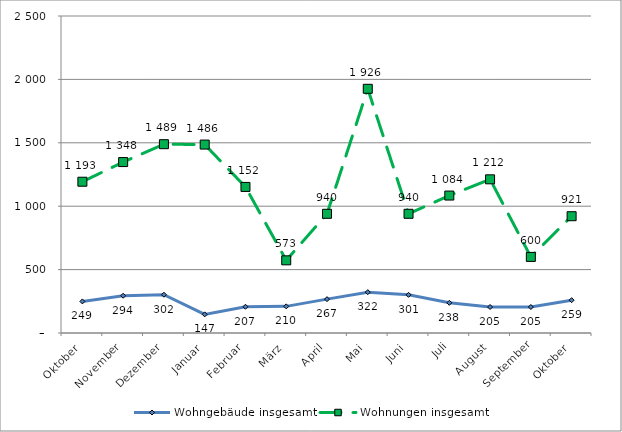
| Category | Wohngebäude insgesamt | Wohnungen insgesamt |
|---|---|---|
| Oktober | 249 | 1193 |
| November | 294 | 1348 |
| Dezember | 302 | 1489 |
| Januar | 147 | 1486 |
| Februar | 207 | 1152 |
| März | 210 | 573 |
| April | 267 | 940 |
| Mai | 322 | 1926 |
| Juni | 301 | 940 |
| Juli | 238 | 1084 |
| August | 205 | 1212 |
| September | 205 | 600 |
| Oktober | 259 | 921 |